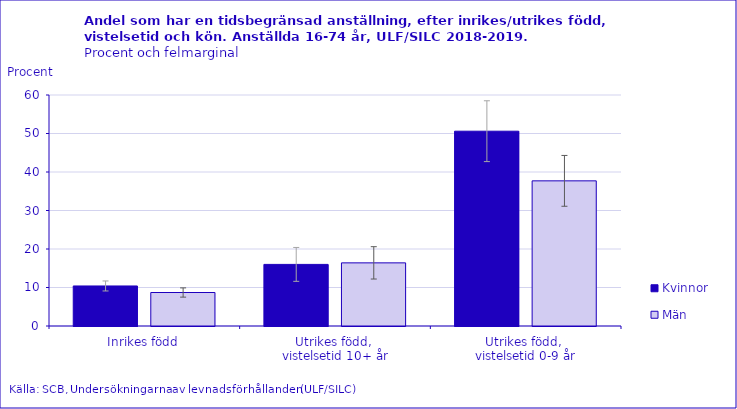
| Category | Kvinnor | Män |
|---|---|---|
| Inrikes född | 10.4 | 8.7 |
| Utrikes född, 
vistelsetid 10+ år | 16 | 16.4 |
| Utrikes född, 
vistelsetid 0-9 år | 50.6 | 37.7 |